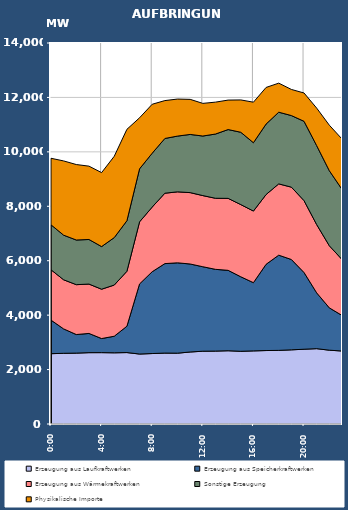
| Category | Erzeugung aus Laufkraftwerken | Erzeugung aus Speicherkraftwerken | Erzeugung aus Wärmekraftwerken | Sonstige Erzeugung | Physikalische Importe |
|---|---|---|---|---|---|
| 2007-01-17 | 2583.877 | 1233.274 | 1850.707 | 1652.598 | 2443.722 |
| 2007-01-17 01:00:00 | 2597.602 | 896.701 | 1805.023 | 1639.126 | 2728.394 |
| 2007-01-17 02:00:00 | 2604.819 | 682.467 | 1832.902 | 1640.919 | 2772.746 |
| 2007-01-17 03:00:00 | 2621.349 | 706.637 | 1813.967 | 1638.268 | 2694.354 |
| 2007-01-17 04:00:00 | 2622.321 | 517.431 | 1813.243 | 1566.754 | 2717.482 |
| 2007-01-17 05:00:00 | 2616.354 | 608.86 | 1881.071 | 1742.957 | 2989.282 |
| 2007-01-17 06:00:00 | 2624.746 | 967.992 | 2019.119 | 1857.522 | 3358.69 |
| 2007-01-17 07:00:00 | 2570.617 | 2577.241 | 2280.51 | 1948.419 | 1875.798 |
| 2007-01-17 08:00:00 | 2589.351 | 3006.539 | 2376.041 | 1978.998 | 1798.814 |
| 2007-01-17 09:00:00 | 2605.933 | 3288.08 | 2586.414 | 2011.341 | 1392.466 |
| 2007-01-17 10:00:00 | 2602.354 | 3320.329 | 2608.339 | 2048.386 | 1361.034 |
| 2007-01-17 11:00:00 | 2645.804 | 3233.95 | 2622.673 | 2138.001 | 1288.672 |
| 2007-01-17 12:00:00 | 2674.604 | 3104.2 | 2614.509 | 2188.738 | 1199.163 |
| 2007-01-17 13:00:00 | 2678.889 | 3004.446 | 2611.356 | 2359.981 | 1172.614 |
| 2007-01-17 14:00:00 | 2691.706 | 2954.6 | 2644.663 | 2528.617 | 1082.88 |
| 2007-01-17 15:00:00 | 2671.394 | 2738.403 | 2653.23 | 2657.234 | 1187.976 |
| 2007-01-17 16:00:00 | 2686.062 | 2507.115 | 2631.771 | 2511.286 | 1489.158 |
| 2007-01-17 17:00:00 | 2699.54 | 3168.536 | 2563.624 | 2589.916 | 1345.118 |
| 2007-01-17 18:00:00 | 2705.12 | 3498.763 | 2619.158 | 2634.557 | 1067.07 |
| 2007-01-17 19:00:00 | 2725.195 | 3318.997 | 2659.154 | 2630.06 | 960.062 |
| 2007-01-17 20:00:00 | 2747.853 | 2819.006 | 2640.917 | 2914.844 | 1040.206 |
| 2007-01-17 21:00:00 | 2768.131 | 2049.803 | 2508.962 | 2900.458 | 1379.39 |
| 2007-01-17 22:00:00 | 2712.132 | 1555.09 | 2281.946 | 2757.005 | 1672.802 |
| 2007-01-17 23:00:00 | 2682.239 | 1308.075 | 2054.879 | 2578.342 | 1849.334 |